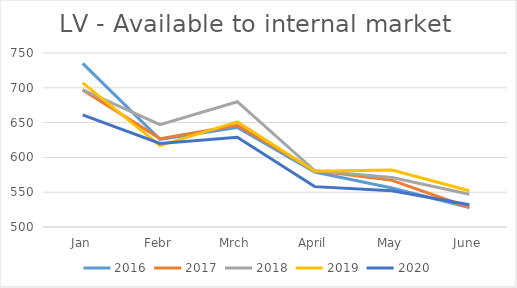
| Category | 2016 | 2017 | 2018 | 2019 | 2020 |
|---|---|---|---|---|---|
| Jan | 735 | 697 | 697 | 707 | 661 |
| Febr | 626 | 627 | 647 | 617 | 620 |
| Mrch | 643 | 646 | 680 | 651 | 629 |
| April | 579 | 581 | 581 | 580 | 558 |
| May | 556 | 567 | 571 | 582 | 552 |
| June | 528 | 528 | 547 | 552 | 532 |